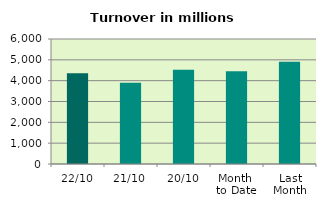
| Category | Series 0 |
|---|---|
| 22/10 | 4356.414 |
| 21/10 | 3899.858 |
| 20/10 | 4518.356 |
| Month 
to Date | 4456.994 |
| Last
Month | 4910.879 |